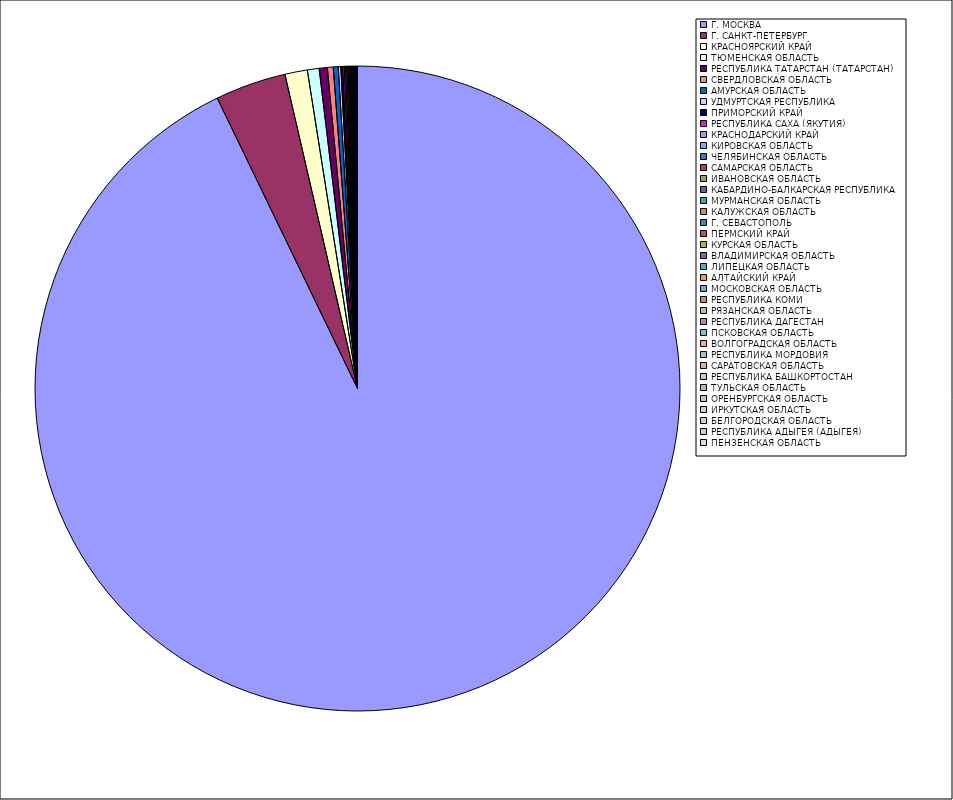
| Category | Оборот |
|---|---|
| Г. МОСКВА | 92.805 |
| Г. САНКТ-ПЕТЕРБУРГ | 3.545 |
| КРАСНОЯРСКИЙ КРАЙ | 1.126 |
| ТЮМЕНСКАЯ ОБЛАСТЬ | 0.589 |
| РЕСПУБЛИКА ТАТАРСТАН (ТАТАРСТАН) | 0.408 |
| СВЕРДЛОВСКАЯ ОБЛАСТЬ | 0.29 |
| АМУРСКАЯ ОБЛАСТЬ | 0.249 |
| УДМУРТСКАЯ РЕСПУБЛИКА | 0.127 |
| ПРИМОРСКИЙ КРАЙ | 0.086 |
| РЕСПУБЛИКА САХА (ЯКУТИЯ) | 0.082 |
| КРАСНОДАРСКИЙ КРАЙ | 0.067 |
| КИРОВСКАЯ ОБЛАСТЬ | 0.059 |
| ЧЕЛЯБИНСКАЯ ОБЛАСТЬ | 0.059 |
| САМАРСКАЯ ОБЛАСТЬ | 0.055 |
| ИВАНОВСКАЯ ОБЛАСТЬ | 0.04 |
| КАБАРДИНО-БАЛКАРСКАЯ РЕСПУБЛИКА | 0.039 |
| МУРМАНСКАЯ ОБЛАСТЬ | 0.036 |
| КАЛУЖСКАЯ ОБЛАСТЬ | 0.032 |
| Г. СЕВАСТОПОЛЬ | 0.021 |
| ПЕРМСКИЙ КРАЙ | 0.02 |
| КУРСКАЯ ОБЛАСТЬ | 0.018 |
| ВЛАДИМИРСКАЯ ОБЛАСТЬ | 0.017 |
| ЛИПЕЦКАЯ ОБЛАСТЬ | 0.016 |
| АЛТАЙСКИЙ КРАЙ | 0.016 |
| МОСКОВСКАЯ ОБЛАСТЬ | 0.016 |
| РЕСПУБЛИКА КОМИ | 0.015 |
| РЯЗАНСКАЯ ОБЛАСТЬ | 0.015 |
| РЕСПУБЛИКА ДАГЕСТАН | 0.014 |
| ПСКОВСКАЯ ОБЛАСТЬ | 0.012 |
| ВОЛГОГРАДСКАЯ ОБЛАСТЬ | 0.012 |
| РЕСПУБЛИКА МОРДОВИЯ | 0.011 |
| САРАТОВСКАЯ ОБЛАСТЬ | 0.011 |
| РЕСПУБЛИКА БАШКОРТОСТАН | 0.01 |
| ТУЛЬСКАЯ ОБЛАСТЬ | 0.01 |
| ОРЕНБУРГСКАЯ ОБЛАСТЬ | 0.009 |
| ИРКУТСКАЯ ОБЛАСТЬ | 0.008 |
| БЕЛГОРОДСКАЯ ОБЛАСТЬ | 0.007 |
| РЕСПУБЛИКА АДЫГЕЯ (АДЫГЕЯ) | 0.007 |
| ПЕНЗЕНСКАЯ ОБЛАСТЬ | 0.006 |